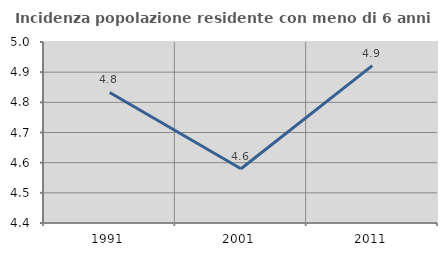
| Category | Incidenza popolazione residente con meno di 6 anni |
|---|---|
| 1991.0 | 4.833 |
| 2001.0 | 4.58 |
| 2011.0 | 4.922 |